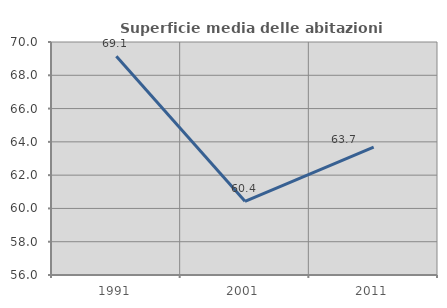
| Category | Superficie media delle abitazioni occupate |
|---|---|
| 1991.0 | 69.138 |
| 2001.0 | 60.425 |
| 2011.0 | 63.683 |